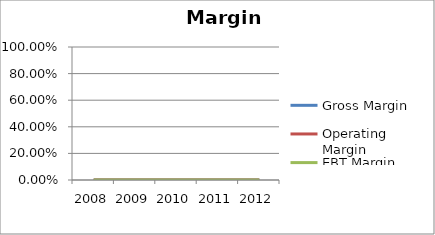
| Category | Gross Margin | Operating Margin | EBT Margin |
|---|---|---|---|
| 2008.0 | 0 | 0 | 0 |
| 2009.0 | 0 | 0 | 0 |
| 2010.0 | 0 | 0 | 0 |
| 2011.0 | 0 | 0 | 0 |
| 2012.0 | 0 | 0 | 0 |